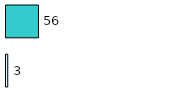
| Category | Series 0 | Series 1 |
|---|---|---|
| 0 | 3 | 56 |